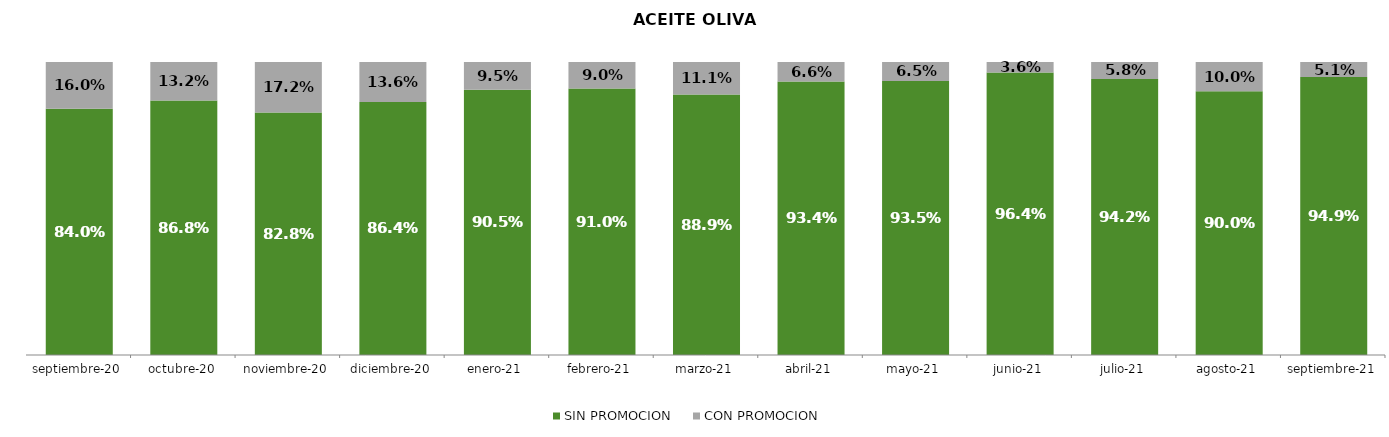
| Category | SIN PROMOCION   | CON PROMOCION   |
|---|---|---|
| 2020-09-01 | 0.84 | 0.16 |
| 2020-10-01 | 0.868 | 0.132 |
| 2020-11-01 | 0.828 | 0.172 |
| 2020-12-01 | 0.864 | 0.136 |
| 2021-01-01 | 0.905 | 0.095 |
| 2021-02-01 | 0.91 | 0.09 |
| 2021-03-01 | 0.889 | 0.111 |
| 2021-04-01 | 0.934 | 0.066 |
| 2021-05-01 | 0.935 | 0.065 |
| 2021-06-01 | 0.964 | 0.036 |
| 2021-07-01 | 0.942 | 0.058 |
| 2021-08-01 | 0.9 | 0.1 |
| 2021-09-01 | 0.949 | 0.051 |